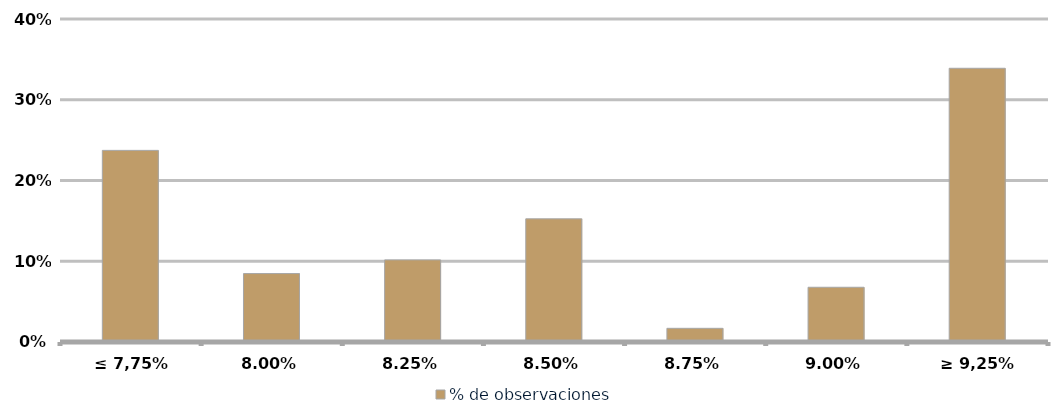
| Category | % de observaciones  |
|---|---|
| ≤ 7,75% | 0.237 |
| 8,00% | 0.085 |
| 8,25% | 0.102 |
| 8,50% | 0.153 |
| 8,75% | 0.017 |
| 9,00% | 0.068 |
| ≥ 9,25% | 0.339 |